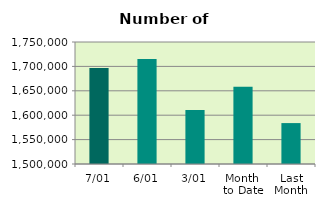
| Category | Series 0 |
|---|---|
| 7/01 | 1696608 |
| 6/01 | 1715030 |
| 3/01 | 1610692 |
| Month 
to Date | 1658161.5 |
| Last
Month | 1583843.3 |